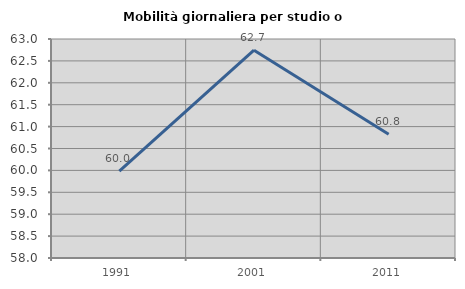
| Category | Mobilità giornaliera per studio o lavoro |
|---|---|
| 1991.0 | 59.982 |
| 2001.0 | 62.745 |
| 2011.0 | 60.824 |